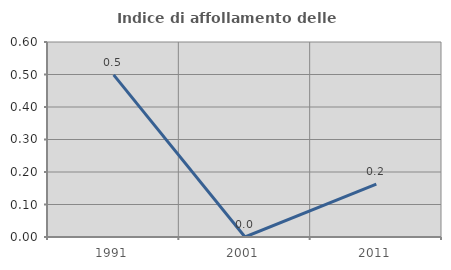
| Category | Indice di affollamento delle abitazioni  |
|---|---|
| 1991.0 | 0.499 |
| 2001.0 | 0 |
| 2011.0 | 0.163 |